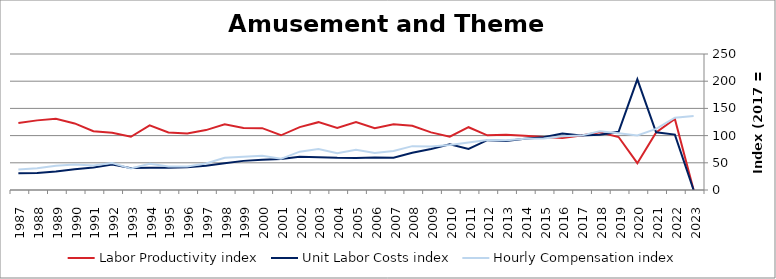
| Category | Labor Productivity index | Unit Labor Costs index | Hourly Compensation index |
|---|---|---|---|
| 2023.0 | 0 | 0 | 135.841 |
| 2022.0 | 130.58 | 101.819 | 132.955 |
| 2021.0 | 105.861 | 106.191 | 112.416 |
| 2020.0 | 49.33 | 203.469 | 100.372 |
| 2019.0 | 97.385 | 106.913 | 104.118 |
| 2018.0 | 106.249 | 101.713 | 108.069 |
| 2017.0 | 100 | 100 | 100 |
| 2016.0 | 95.37 | 103.626 | 98.828 |
| 2015.0 | 97.45 | 97.118 | 94.641 |
| 2014.0 | 99.822 | 94.178 | 94.01 |
| 2013.0 | 101.519 | 89.871 | 91.237 |
| 2012.0 | 100.502 | 91.66 | 92.121 |
| 2011.0 | 115.42 | 75.582 | 87.237 |
| 2010.0 | 98.13 | 84.119 | 82.546 |
| 2009.0 | 105.883 | 75.344 | 79.777 |
| 2008.0 | 118.013 | 68.299 | 80.602 |
| 2007.0 | 120.896 | 59.361 | 71.765 |
| 2006.0 | 113.479 | 59.832 | 67.897 |
| 2005.0 | 125.082 | 58.966 | 73.756 |
| 2004.0 | 114.256 | 59.083 | 67.506 |
| 2003.0 | 124.701 | 60.312 | 75.21 |
| 2002.0 | 115.626 | 60.914 | 70.432 |
| 2001.0 | 100.565 | 56.955 | 57.277 |
| 2000.0 | 113.634 | 55.562 | 63.137 |
| 1999.0 | 113.785 | 53.539 | 60.919 |
| 1998.0 | 120.666 | 49.195 | 59.362 |
| 1997.0 | 110.102 | 44.395 | 48.88 |
| 1996.0 | 103.874 | 41.751 | 43.368 |
| 1995.0 | 105.626 | 40.871 | 43.17 |
| 1994.0 | 118.89 | 40.7 | 48.389 |
| 1993.0 | 97.807 | 40.244 | 39.362 |
| 1992.0 | 105.106 | 47.006 | 49.406 |
| 1991.0 | 108.16 | 41.509 | 44.896 |
| 1990.0 | 122.377 | 38.123 | 46.653 |
| 1989.0 | 131.008 | 33.887 | 44.395 |
| 1988.0 | 127.99 | 31.336 | 40.107 |
| 1987.0 | 122.982 | 30.581 | 37.609 |